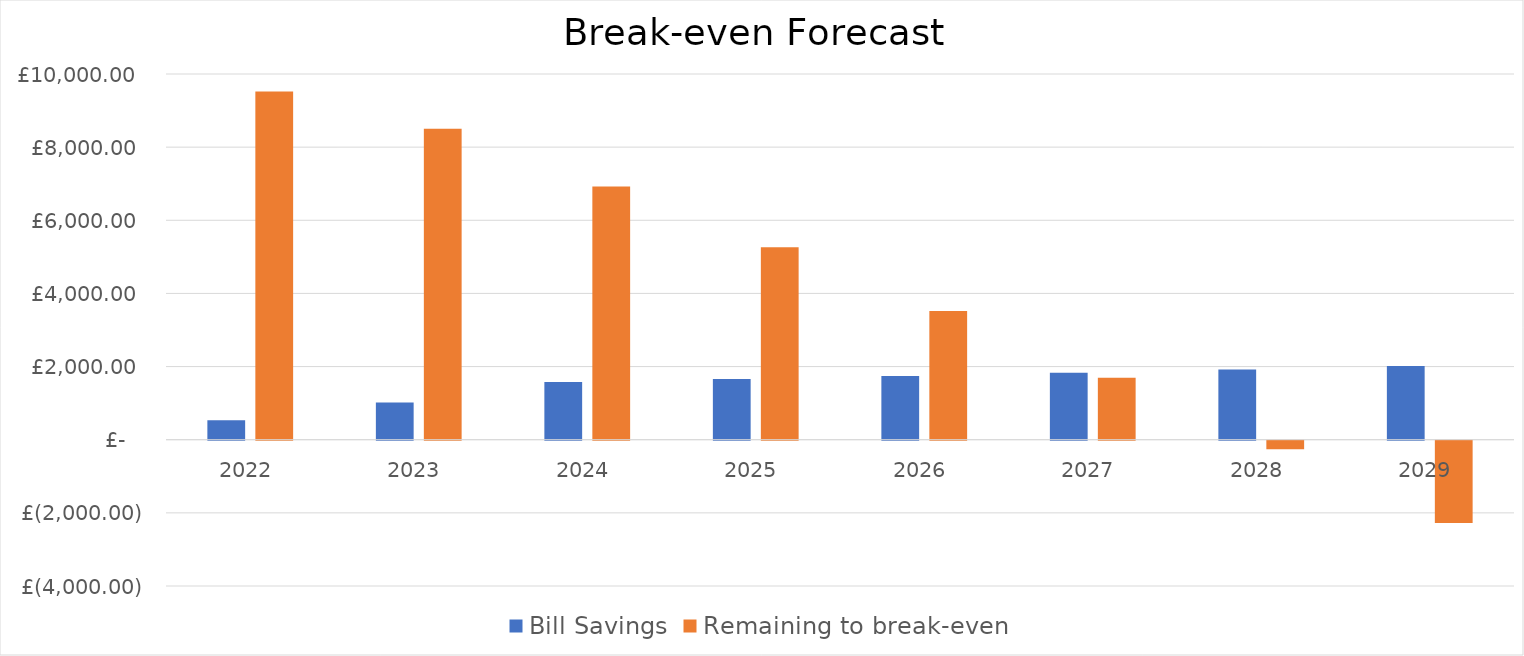
| Category |  Bill Savings  |  Remaining to break-even  |
|---|---|---|
| 2022.0 | 531.292 | 9524.308 |
| 2023.0 | 1019.662 | 8504.646 |
| 2024.0 | 1580.827 | 6923.819 |
| 2025.0 | 1659.868 | 5263.951 |
| 2026.0 | 1742.862 | 3521.089 |
| 2027.0 | 1830.005 | 1691.084 |
| 2028.0 | 1921.505 | -230.421 |
| 2029.0 | 2017.58 | -2248.001 |